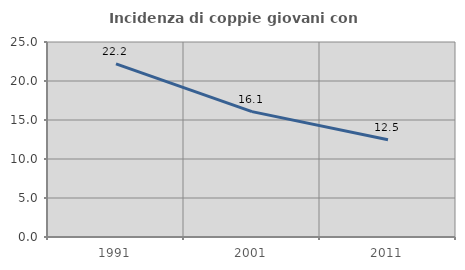
| Category | Incidenza di coppie giovani con figli |
|---|---|
| 1991.0 | 22.192 |
| 2001.0 | 16.073 |
| 2011.0 | 12.477 |